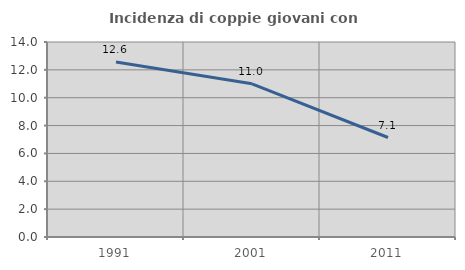
| Category | Incidenza di coppie giovani con figli |
|---|---|
| 1991.0 | 12.558 |
| 2001.0 | 11 |
| 2011.0 | 7.143 |